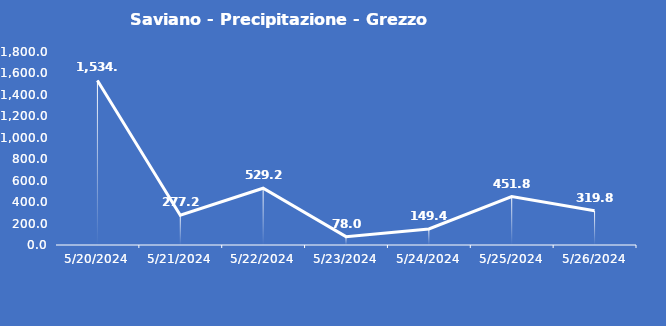
| Category | Saviano - Precipitazione - Grezzo (mm) |
|---|---|
| 5/20/24 | 1534.8 |
| 5/21/24 | 277.2 |
| 5/22/24 | 529.2 |
| 5/23/24 | 78 |
| 5/24/24 | 149.4 |
| 5/25/24 | 451.8 |
| 5/26/24 | 319.8 |